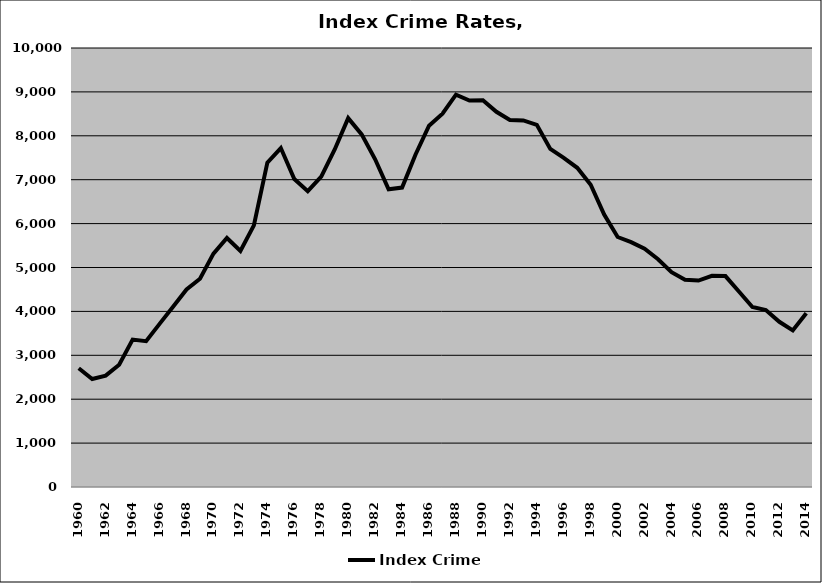
| Category | Index Crime |
|---|---|
| 1960.0 | 2704.582 |
| 1961.0 | 2461.126 |
| 1962.0 | 2537.406 |
| 1963.0 | 2785.97 |
| 1964.0 | 3358.107 |
| 1965.0 | 3320.189 |
| 1966.0 | 3716.294 |
| 1967.0 | 4103.603 |
| 1968.0 | 4498.49 |
| 1969.0 | 4742.54 |
| 1970.0 | 5317.167 |
| 1971.0 | 5673.044 |
| 1972.0 | 5376.856 |
| 1973.0 | 5960.289 |
| 1974.0 | 7387.342 |
| 1975.0 | 7721.228 |
| 1976.0 | 7016.744 |
| 1977.0 | 6738.594 |
| 1978.0 | 7069.49 |
| 1979.0 | 7688.059 |
| 1980.0 | 8401.961 |
| 1981.0 | 8032.451 |
| 1982.0 | 7465.217 |
| 1983.0 | 6781.142 |
| 1984.0 | 6821.237 |
| 1985.0 | 7574.248 |
| 1986.0 | 8228.385 |
| 1987.0 | 8503.161 |
| 1988.0 | 8937.642 |
| 1989.0 | 8804.491 |
| 1990.0 | 8810.794 |
| 1991.0 | 8547.209 |
| 1992.0 | 8358.244 |
| 1993.0 | 8351.034 |
| 1994.0 | 8249.989 |
| 1995.0 | 7701.532 |
| 1996.0 | 7497.382 |
| 1997.0 | 7271.796 |
| 1998.0 | 6886.049 |
| 1999.0 | 6205.432 |
| 2000.0 | 5694.735 |
| 2001.0 | 5577.546 |
| 2002.0 | 5427.589 |
| 2003.0 | 5188.344 |
| 2004.0 | 4894.299 |
| 2005.0 | 4721.668 |
| 2006.0 | 4702.644 |
| 2007.0 | 4811.371 |
| 2008.0 | 4804.45 |
| 2009.0 | 4453.298 |
| 2010.0 | 4100.799 |
| 2011.0 | 4032.006 |
| 2012.0 | 3763.182 |
| 2013.0 | 3567.102 |
| 2014.0 | 3955.941 |